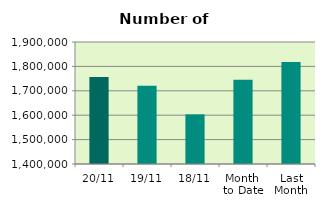
| Category | Series 0 |
|---|---|
| 20/11 | 1756526 |
| 19/11 | 1720378 |
| 18/11 | 1603440 |
| Month 
to Date | 1744888.714 |
| Last
Month | 1817802.609 |